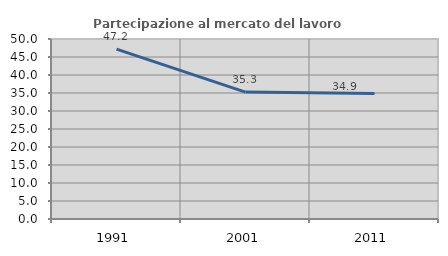
| Category | Partecipazione al mercato del lavoro  femminile |
|---|---|
| 1991.0 | 47.171 |
| 2001.0 | 35.262 |
| 2011.0 | 34.87 |